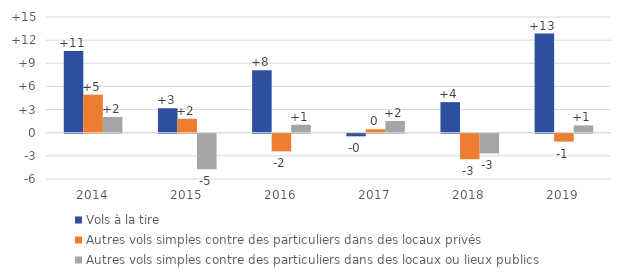
| Category | Vols à la tire | Autres vols simples contre des particuliers dans des locaux privés
 | Autres vols simples contre des particuliers dans des locaux ou lieux publics |
|---|---|---|---|
| 2014.0 | 10.59 | 4.926 | 2.042 |
| 2015.0 | 3.17 | 1.806 | -4.613 |
| 2016.0 | 8.113 | -2.282 | 1.034 |
| 2017.0 | -0.338 | 0.45 | 1.519 |
| 2018.0 | 3.962 | -3.307 | -2.555 |
| 2019.0 | 12.846 | -1.026 | 0.948 |